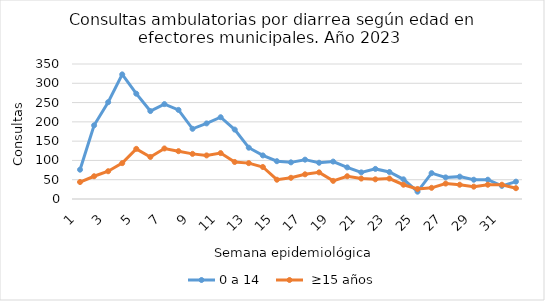
| Category | 0 a 14  |  ≥15 años |
|---|---|---|
| 1.0 | 76 | 44 |
| 2.0 | 191 | 59 |
| 3.0 | 251 | 72 |
| 4.0 | 323 | 93 |
| 5.0 | 273 | 130 |
| 6.0 | 228 | 109 |
| 7.0 | 246 | 131 |
| 8.0 | 231 | 124 |
| 9.0 | 182 | 117 |
| 10.0 | 196 | 113 |
| 11.0 | 212 | 119 |
| 12.0 | 180 | 96 |
| 13.0 | 133 | 93 |
| 14.0 | 113 | 83 |
| 15.0 | 98 | 50 |
| 16.0 | 95 | 55 |
| 17.0 | 102 | 64 |
| 18.0 | 94 | 69 |
| 19.0 | 97 | 47 |
| 20.0 | 82 | 59 |
| 21.0 | 69 | 53 |
| 22.0 | 78 | 51 |
| 23.0 | 70 | 53 |
| 24.0 | 51 | 37 |
| 25.0 | 19 | 26 |
| 26.0 | 67 | 29 |
| 27.0 | 56 | 40 |
| 28.0 | 58 | 37 |
| 29.0 | 50 | 32 |
| 30.0 | 50 | 37 |
| 31.0 | 34 | 37 |
| 32.0 | 45 | 28 |